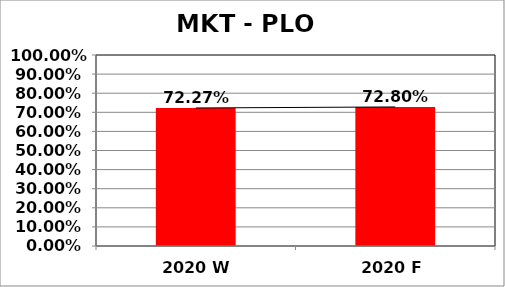
| Category | Series 0 |
|---|---|
| 2020 W | 0.723 |
| 2020 F | 0.728 |